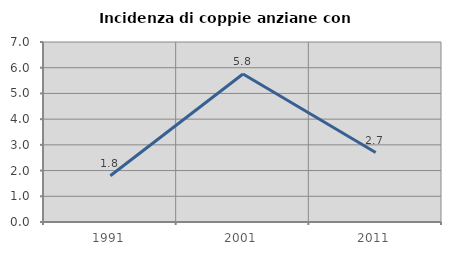
| Category | Incidenza di coppie anziane con figli |
|---|---|
| 1991.0 | 1.796 |
| 2001.0 | 5.755 |
| 2011.0 | 2.703 |